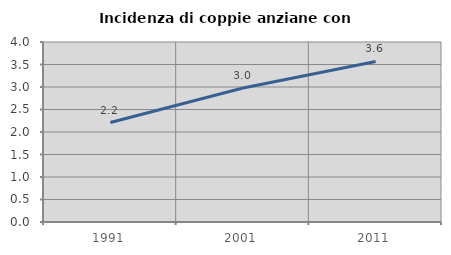
| Category | Incidenza di coppie anziane con figli |
|---|---|
| 1991.0 | 2.21 |
| 2001.0 | 2.977 |
| 2011.0 | 3.568 |